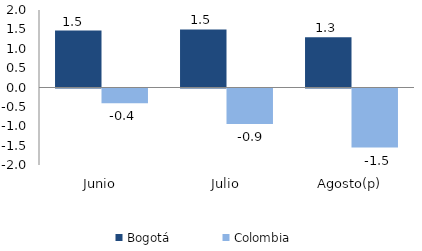
| Category | Bogotá | Colombia |
|---|---|---|
| Junio | 1.47 | -0.383 |
| Julio | 1.499 | -0.919 |
| Agosto(p) | 1.296 | -1.525 |